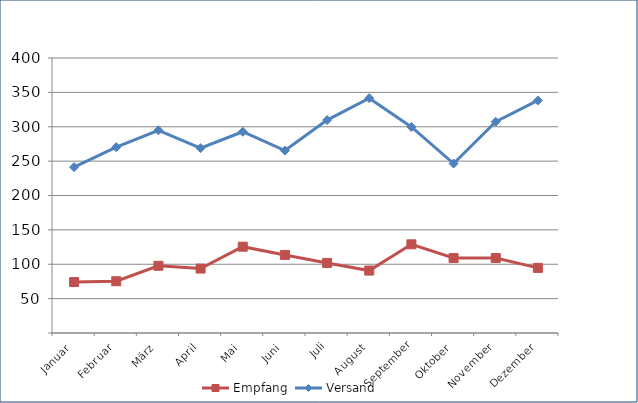
| Category | Empfang | Versand |
|---|---|---|
| Januar | 74.117 | 241.252 |
| Februar | 75.291 | 270.281 |
| März | 97.763 | 294.851 |
| April | 93.723 | 268.902 |
| Mai | 125.583 | 292.732 |
| Juni | 113.532 | 265.327 |
| Juli | 101.931 | 309.749 |
| August | 90.825 | 341.589 |
| September | 129 | 299.686 |
| Oktober | 109.04 | 246.439 |
| November | 109.033 | 307.23 |
| Dezember | 94.694 | 338.281 |